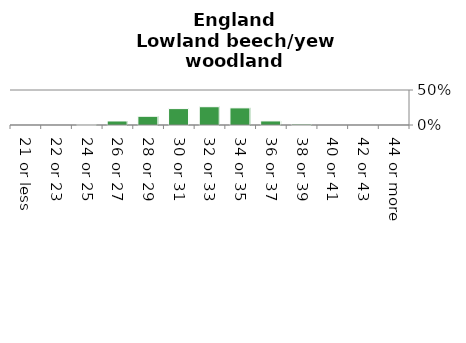
| Category | Lowland beech/yew woodland |
|---|---|
| 21 or less | 0 |
| 22 or 23 | 0 |
| 24 or 25 | 0.006 |
| 26 or 27 | 0.057 |
| 28 or 29 | 0.125 |
| 30 or 31 | 0.234 |
| 32 or 33 | 0.261 |
| 34 or 35 | 0.245 |
| 36 or 37 | 0.058 |
| 38 or 39 | 0.013 |
| 40 or 41 | 0 |
| 42 or 43 | 0 |
| 44 or more | 0 |